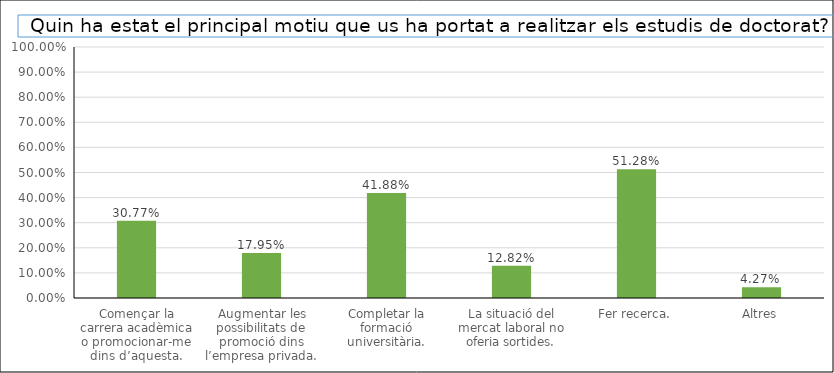
| Category | Series 0 |
|---|---|
| Començar la carrera acadèmica o promocionar-me dins d’aquesta. | 0.308 |
| Augmentar les possibilitats de promoció dins l’empresa privada. | 0.179 |
| Completar la formació universitària. | 0.419 |
| La situació del mercat laboral no oferia sortides. | 0.128 |
| Fer recerca. | 0.513 |
| Altres | 0.043 |